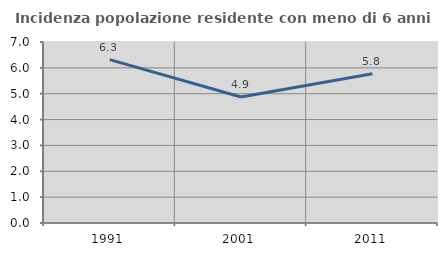
| Category | Incidenza popolazione residente con meno di 6 anni |
|---|---|
| 1991.0 | 6.319 |
| 2001.0 | 4.871 |
| 2011.0 | 5.776 |